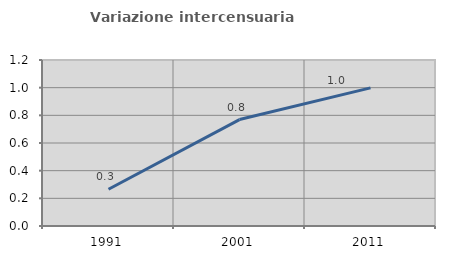
| Category | Variazione intercensuaria annua |
|---|---|
| 1991.0 | 0.266 |
| 2001.0 | 0.769 |
| 2011.0 | 0.998 |